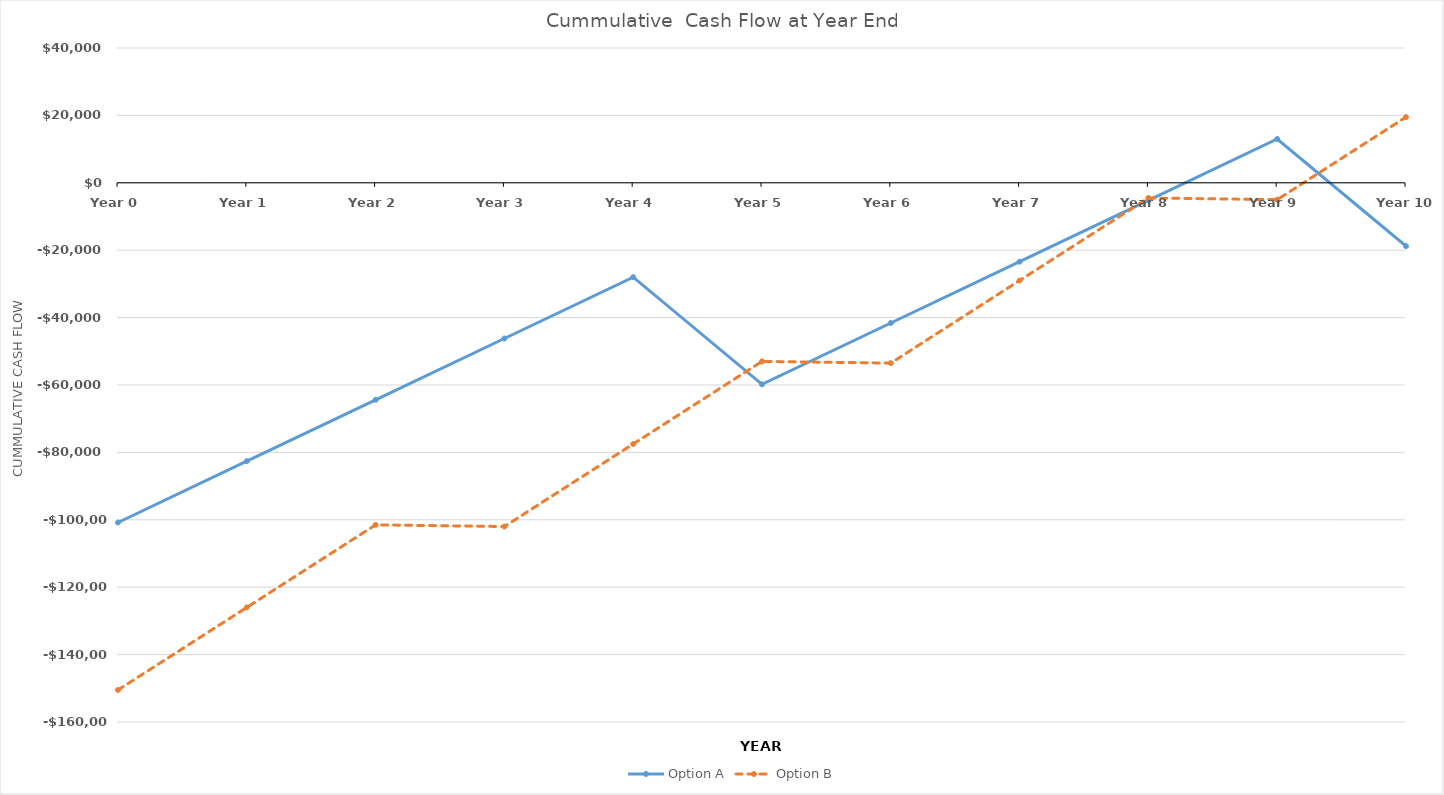
| Category | Option A | Option B |
|---|---|---|
| Year 0 | -100800 | -150500 |
| Year 1 | -82600 | -126000 |
| Year 2 | -64400 | -101500 |
| Year 3 | -46200 | -102000 |
| Year 4 | -28000 | -77500 |
| Year 5 | -59800 | -53000 |
| Year 6 | -41600 | -53500 |
| Year 7 | -23400 | -29000 |
| Year 8 | -5200 | -4500 |
| Year 9 | 13000 | -5000 |
| Year 10 | -18800 | 19500 |